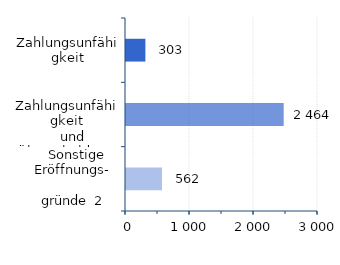
| Category | Series 0 |
|---|---|
| Zahlungsunfähigkeit | 303 |
|   Zahlungsunfähigkeit
   und Überschuldung | 2464 |
|   Sonstige Eröffnungs-
                      gründe  2 | 562 |